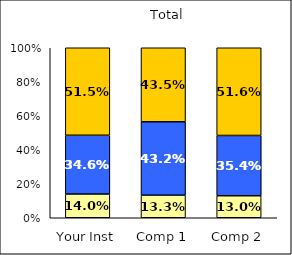
| Category | Low Scholarly Productivity | Average Scholarly Productivity | High Scholarly Productivity |
|---|---|---|---|
| Your Inst | 0.14 | 0.346 | 0.515 |
| Comp 1 | 0.133 | 0.432 | 0.435 |
| Comp 2 | 0.13 | 0.354 | 0.516 |